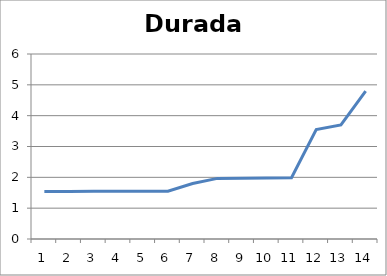
| Category | Durada anys |
|---|---|
| 0 | 1.544 |
| 1 | 1.544 |
| 2 | 1.547 |
| 3 | 1.547 |
| 4 | 1.547 |
| 5 | 1.55 |
| 6 | 1.799 |
| 7 | 1.966 |
| 8 | 1.969 |
| 9 | 1.979 |
| 10 | 1.985 |
| 11 | 3.548 |
| 12 | 3.702 |
| 13 | 4.799 |